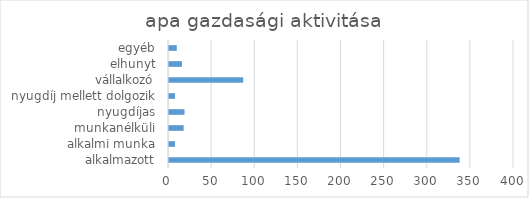
| Category | Series 0 |
|---|---|
| alkalmazott | 337 |
| alkalmi munka | 7 |
| munkanélküli | 17 |
| nyugdíjas | 18 |
| nyugdíj mellett dolgozik | 7 |
| vállalkozó | 86 |
| elhunyt | 15 |
| egyéb | 9 |